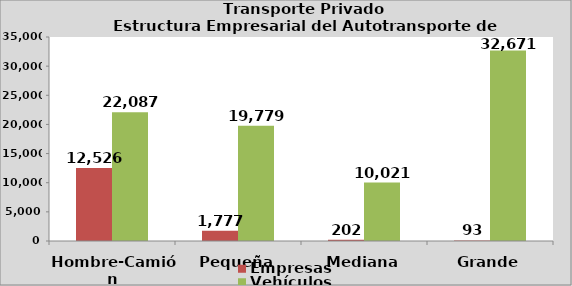
| Category | Empresas | Vehículos |
|---|---|---|
| Hombre-Camión | 12526 | 22087 |
| Pequeña | 1777 | 19779 |
| Mediana | 202 | 10021 |
| Grande | 93 | 32671 |